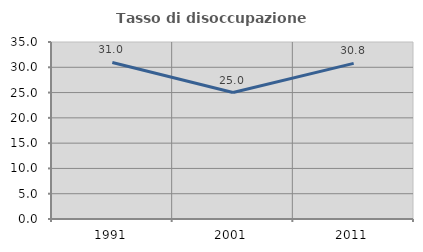
| Category | Tasso di disoccupazione giovanile  |
|---|---|
| 1991.0 | 30.952 |
| 2001.0 | 25 |
| 2011.0 | 30.769 |